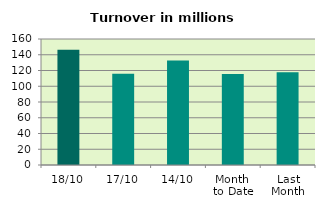
| Category | Series 0 |
|---|---|
| 18/10 | 146.44 |
| 17/10 | 115.886 |
| 14/10 | 132.651 |
| Month 
to Date | 115.511 |
| Last
Month | 117.918 |